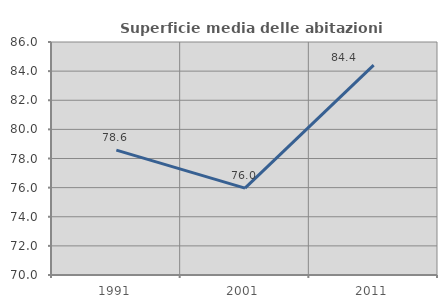
| Category | Superficie media delle abitazioni occupate |
|---|---|
| 1991.0 | 78.571 |
| 2001.0 | 75.968 |
| 2011.0 | 84.417 |